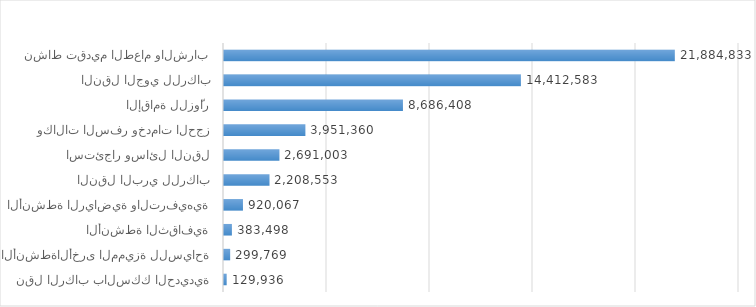
| Category | Series 0 |
|---|---|
| نشاط تقديم الطعام والشراب | 21884833 |
| النقل الجوي للركاب | 14412583 |
| الإقامة للزوّار | 8686408 |
| وكالات السفر وخدمات الحجز | 3951360 |
| استئجار وسائل النقل | 2691003 |
| النقل البري للركاب | 2208553 |
| الأنشطة الرياضية والترفيهية | 920067 |
| الأنشطة الثقافية | 383498 |
| الأنشطةالأخرى المميزة للسياحة | 299769 |
| نقل الركاب بالسكك الحديدية | 129936 |